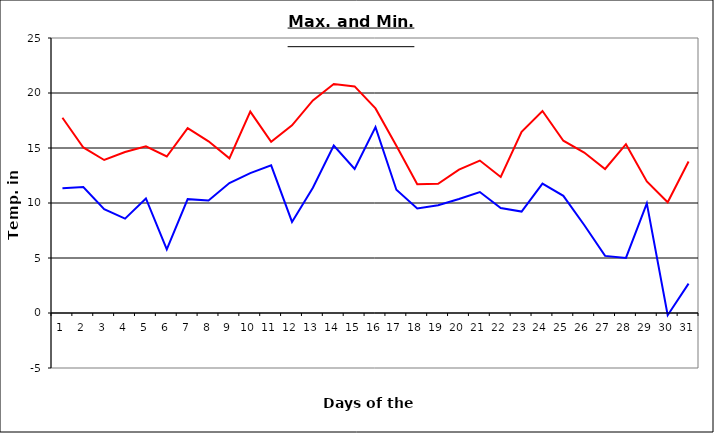
| Category | Series 0 | Series 1 |
|---|---|---|
| 0 | 17.75 | 11.33 |
| 1 | 15.05 | 11.45 |
| 2 | 13.91 | 9.44 |
| 3 | 14.64 | 8.58 |
| 4 | 15.15 | 10.41 |
| 5 | 14.23 | 5.78 |
| 6 | 16.8 | 10.35 |
| 7 | 15.61 | 10.22 |
| 8 | 14.06 | 11.82 |
| 9 | 18.31 | 12.72 |
| 10 | 15.56 | 13.42 |
| 11 | 17.06 | 8.28 |
| 12 | 19.32 | 11.39 |
| 13 | 20.82 | 15.23 |
| 14 | 20.6 | 13.1 |
| 15 | 18.6 | 16.9 |
| 16 | 15.2 | 11.2 |
| 17 | 11.7 | 9.5 |
| 18 | 11.74 | 9.8 |
| 19 | 13.03 | 10.36 |
| 20 | 13.86 | 11 |
| 21 | 12.37 | 9.54 |
| 22 | 16.47 | 9.22 |
| 23 | 18.37 | 11.77 |
| 24 | 15.66 | 10.65 |
| 25 | 14.586 | 8 |
| 26 | 13.09 | 5.19 |
| 27 | 15.35 | 5.01 |
| 28 | 11.96 | 9.97 |
| 29 | 10.07 | -0.2 |
| 30 | 13.77 | 2.67 |